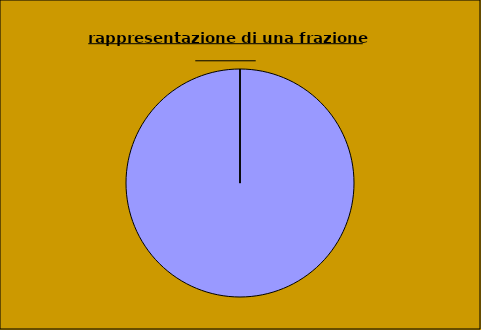
| Category | Series 0 |
|---|---|
| x | 4 |
| y | 0 |